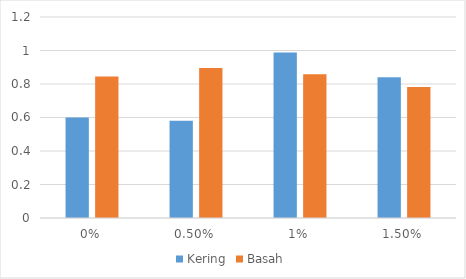
| Category | Kering | Basah |
|---|---|---|
| 0.0 | 0.6 | 0.845 |
| 0.005 | 0.58 | 0.895 |
| 0.01 | 0.988 | 0.858 |
| 0.015 | 0.84 | 0.782 |